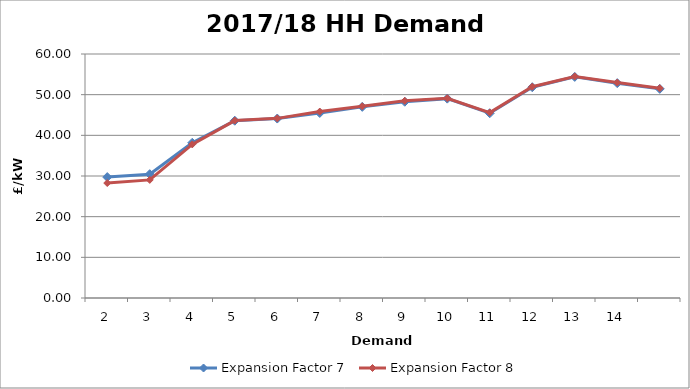
| Category | Expansion Factor 7 | Expansion Factor 8 |
|---|---|---|
| 2.0 | 29.732 | 28.275 |
| 3.0 | 30.446 | 29.042 |
| 4.0 | 38.161 | 37.774 |
| 5.0 | 43.593 | 43.63 |
| 6.0 | 44.126 | 44.173 |
| 7.0 | 45.498 | 45.844 |
| 8.0 | 47.007 | 47.139 |
| 9.0 | 48.259 | 48.482 |
| 10.0 | 49.023 | 49.126 |
| 11.0 | 45.437 | 45.601 |
| 12.0 | 51.83 | 51.952 |
| 13.0 | 54.371 | 54.484 |
| 14.0 | 52.832 | 52.969 |